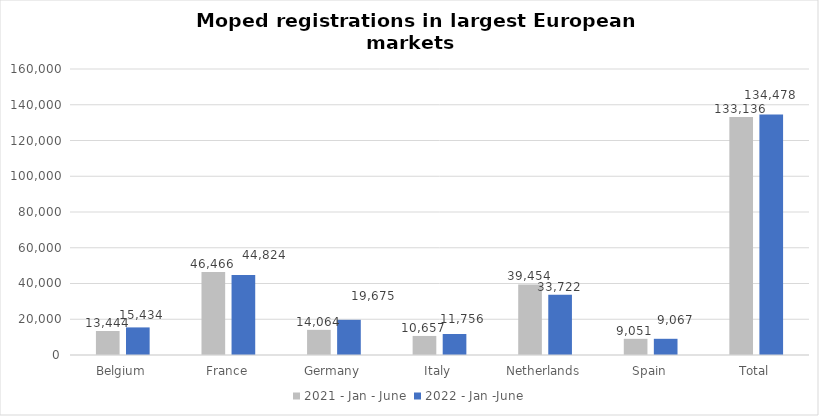
| Category | 2021 - Jan - June | 2022 - Jan -June |
|---|---|---|
| Belgium | 13444 | 15434 |
| France | 46466 | 44824 |
| Germany | 14064 | 19675 |
| Italy | 10657 | 11756 |
| Netherlands | 39454 | 33722 |
| Spain | 9051 | 9067 |
| Total | 133136 | 134478 |